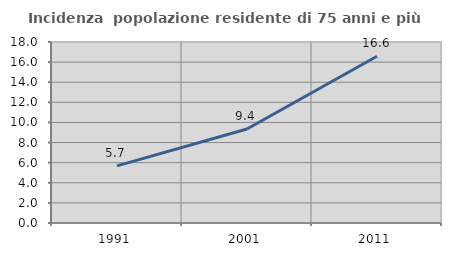
| Category | Incidenza  popolazione residente di 75 anni e più |
|---|---|
| 1991.0 | 5.684 |
| 2001.0 | 9.353 |
| 2011.0 | 16.577 |